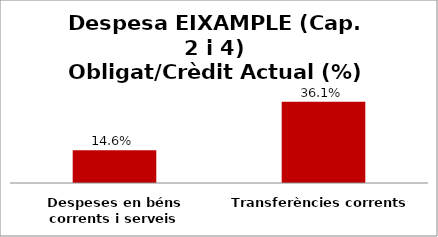
| Category | Series 0 |
|---|---|
| Despeses en béns corrents i serveis | 0.146 |
| Transferències corrents | 0.361 |